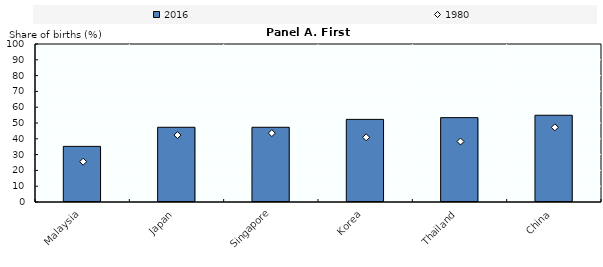
| Category | 2016 |
|---|---|
| Malaysia | 35.2 |
| Japan | 47.3 |
| Singapore | 47.3 |
| Korea | 52.29 |
| Thailand | 53.4 |
| China | 54.9 |